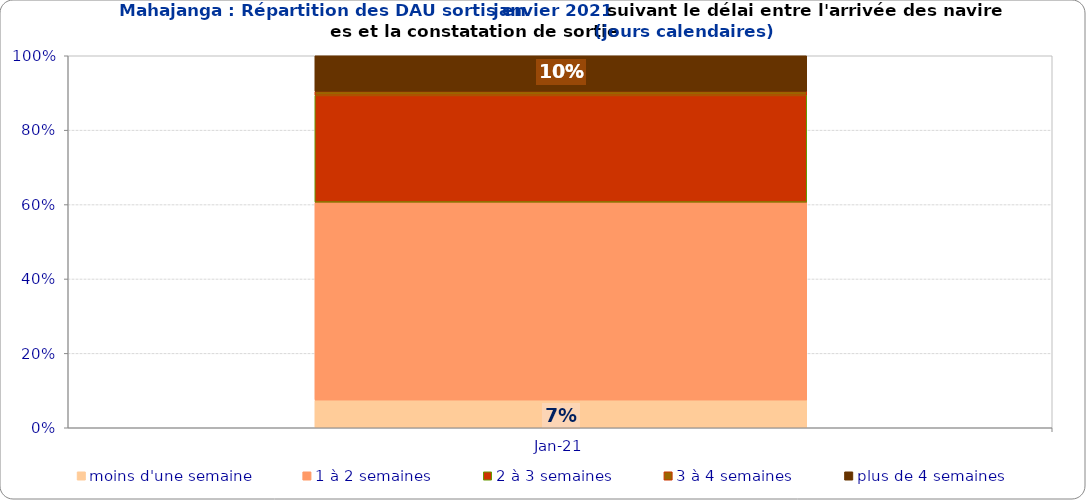
| Category | moins d'une semaine | 1 à 2 semaines | 2 à 3 semaines | 3 à 4 semaines | plus de 4 semaines |
|---|---|---|---|---|---|
| 2021-01-01 | 0.074 | 0.532 | 0.287 | 0.011 | 0.096 |